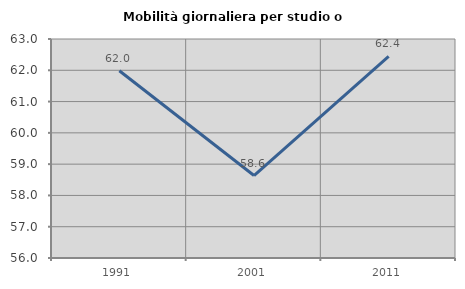
| Category | Mobilità giornaliera per studio o lavoro |
|---|---|
| 1991.0 | 61.984 |
| 2001.0 | 58.635 |
| 2011.0 | 62.446 |